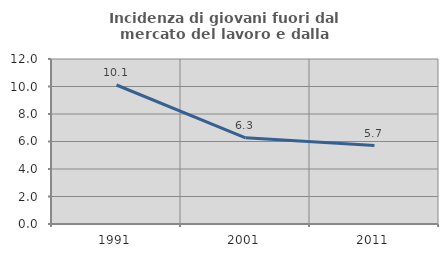
| Category | Incidenza di giovani fuori dal mercato del lavoro e dalla formazione  |
|---|---|
| 1991.0 | 10.109 |
| 2001.0 | 6.27 |
| 2011.0 | 5.705 |